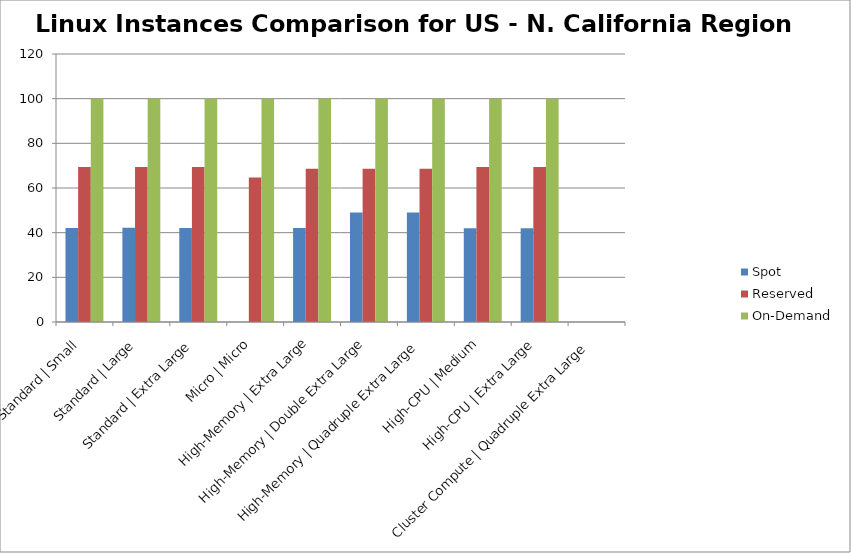
| Category | Spot | Reserved | On-Demand |
|---|---|---|---|
| Standard | Small | 42.132 | 69.442 | 100 |
| Standard | Large | 42.167 | 69.442 | 100 |
| Standard | Extra Large | 42.075 | 69.442 | 100 |
| Micro | Micro | 0 | 64.658 | 100 |
| High-Memory | Extra Large | 42.046 | 68.641 | 100 |
| High-Memory | Double Extra Large | 49.006 | 68.641 | 100 |
| High-Memory | Quadruple Extra Large | 49.06 | 68.641 | 100 |
| High-CPU | Medium | 42.032 | 69.442 | 100 |
| High-CPU | Extra Large | 42.004 | 69.442 | 100 |
| Cluster Compute | Quadruple Extra Large | 0 | 0 | 0 |